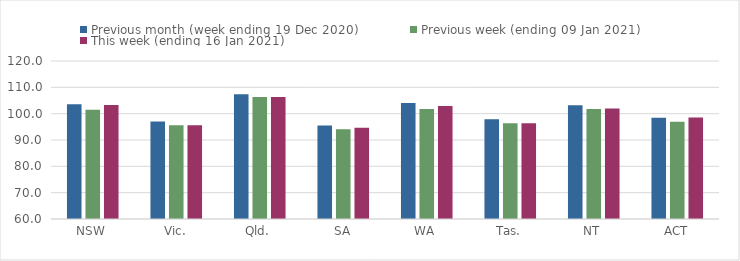
| Category | Previous month (week ending 19 Dec 2020) | Previous week (ending 09 Jan 2021) | This week (ending 16 Jan 2021) |
|---|---|---|---|
| NSW | 103.54 | 101.53 | 103.3 |
| Vic. | 97.01 | 95.58 | 95.58 |
| Qld. | 107.42 | 106.31 | 106.31 |
| SA | 95.5 | 94.08 | 94.64 |
| WA | 104.01 | 101.74 | 102.92 |
| Tas. | 97.92 | 96.34 | 96.34 |
| NT | 103.16 | 101.76 | 101.92 |
| ACT | 98.41 | 96.95 | 98.57 |